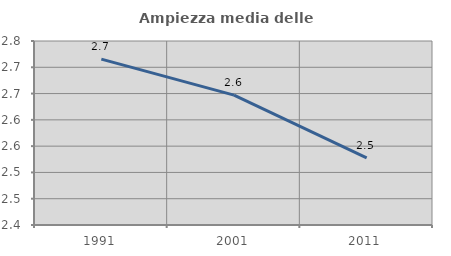
| Category | Ampiezza media delle famiglie |
|---|---|
| 1991.0 | 2.715 |
| 2001.0 | 2.647 |
| 2011.0 | 2.528 |